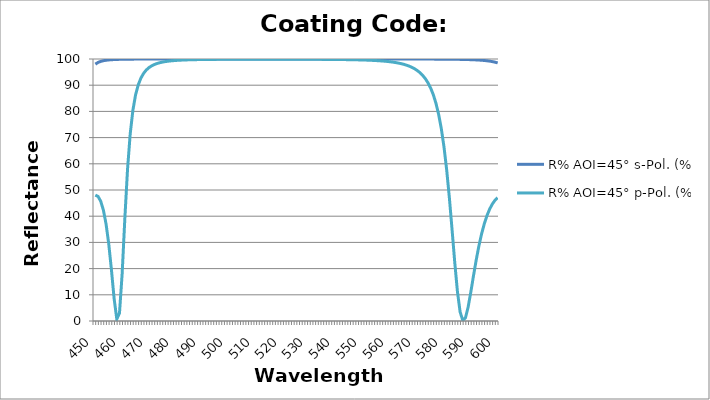
| Category | R% AOI=45° s-Pol. (%) | R% AOI=45° p-Pol. (%) |
|---|---|---|
| 450.0 | 98.025 | 48.06 |
| 451.0 | 98.683 | 47.558 |
| 452.0 | 99.088 | 45.725 |
| 453.0 | 99.349 | 42.319 |
| 454.0 | 99.523 | 37.002 |
| 455.0 | 99.643 | 29.419 |
| 456.0 | 99.727 | 19.526 |
| 457.0 | 99.788 | 8.559 |
| 458.0 | 99.833 | 0.729 |
| 459.0 | 99.866 | 2.992 |
| 460.0 | 99.892 | 18.081 |
| 461.0 | 99.911 | 39.146 |
| 462.0 | 99.926 | 57.883 |
| 463.0 | 99.938 | 71.419 |
| 464.0 | 99.948 | 80.43 |
| 465.0 | 99.956 | 86.316 |
| 466.0 | 99.962 | 90.147 |
| 467.0 | 99.967 | 92.739 |
| 468.0 | 99.972 | 94.532 |
| 469.0 | 99.975 | 95.8 |
| 470.0 | 99.978 | 96.716 |
| 471.0 | 99.981 | 97.391 |
| 472.0 | 99.983 | 97.897 |
| 473.0 | 99.985 | 98.282 |
| 474.0 | 99.986 | 98.579 |
| 475.0 | 99.988 | 98.812 |
| 476.0 | 99.989 | 98.997 |
| 477.0 | 99.99 | 99.145 |
| 478.0 | 99.99 | 99.265 |
| 479.0 | 99.991 | 99.363 |
| 480.0 | 99.992 | 99.443 |
| 481.0 | 99.993 | 99.51 |
| 482.0 | 99.993 | 99.566 |
| 483.0 | 99.994 | 99.613 |
| 484.0 | 99.994 | 99.653 |
| 485.0 | 99.994 | 99.687 |
| 486.0 | 99.995 | 99.716 |
| 487.0 | 99.995 | 99.742 |
| 488.0 | 99.995 | 99.763 |
| 489.0 | 99.996 | 99.782 |
| 490.0 | 99.996 | 99.798 |
| 491.0 | 99.996 | 99.812 |
| 492.0 | 99.996 | 99.825 |
| 493.0 | 99.996 | 99.836 |
| 494.0 | 99.996 | 99.845 |
| 495.0 | 99.996 | 99.854 |
| 496.0 | 99.997 | 99.862 |
| 497.0 | 99.997 | 99.868 |
| 498.0 | 99.997 | 99.874 |
| 499.0 | 99.997 | 99.879 |
| 500.0 | 99.997 | 99.884 |
| 501.0 | 99.997 | 99.888 |
| 502.0 | 99.997 | 99.892 |
| 503.0 | 99.997 | 99.895 |
| 504.0 | 99.997 | 99.898 |
| 505.0 | 99.997 | 99.9 |
| 506.0 | 99.997 | 99.902 |
| 507.0 | 99.997 | 99.904 |
| 508.0 | 99.997 | 99.906 |
| 509.0 | 99.997 | 99.907 |
| 510.0 | 99.997 | 99.908 |
| 511.0 | 99.997 | 99.909 |
| 512.0 | 99.998 | 99.909 |
| 513.0 | 99.998 | 99.91 |
| 514.0 | 99.998 | 99.91 |
| 515.0 | 99.998 | 99.91 |
| 516.0 | 99.998 | 99.91 |
| 517.0 | 99.998 | 99.909 |
| 518.0 | 99.997 | 99.908 |
| 519.0 | 99.997 | 99.907 |
| 520.0 | 99.997 | 99.906 |
| 521.0 | 99.997 | 99.905 |
| 522.0 | 99.997 | 99.903 |
| 523.0 | 99.997 | 99.901 |
| 524.0 | 99.997 | 99.899 |
| 525.0 | 99.997 | 99.897 |
| 526.0 | 99.997 | 99.894 |
| 527.0 | 99.997 | 99.891 |
| 528.0 | 99.997 | 99.888 |
| 529.0 | 99.997 | 99.884 |
| 530.0 | 99.997 | 99.88 |
| 531.0 | 99.997 | 99.875 |
| 532.0 | 99.997 | 99.87 |
| 533.0 | 99.997 | 99.865 |
| 534.0 | 99.997 | 99.859 |
| 535.0 | 99.996 | 99.852 |
| 536.0 | 99.996 | 99.845 |
| 537.0 | 99.996 | 99.837 |
| 538.0 | 99.996 | 99.828 |
| 539.0 | 99.996 | 99.818 |
| 540.0 | 99.996 | 99.807 |
| 541.0 | 99.996 | 99.796 |
| 542.0 | 99.996 | 99.782 |
| 543.0 | 99.995 | 99.768 |
| 544.0 | 99.995 | 99.752 |
| 545.0 | 99.995 | 99.734 |
| 546.0 | 99.995 | 99.714 |
| 547.0 | 99.994 | 99.692 |
| 548.0 | 99.994 | 99.667 |
| 549.0 | 99.994 | 99.639 |
| 550.0 | 99.994 | 99.608 |
| 551.0 | 99.993 | 99.572 |
| 552.0 | 99.993 | 99.532 |
| 553.0 | 99.992 | 99.488 |
| 554.0 | 99.992 | 99.436 |
| 555.0 | 99.991 | 99.378 |
| 556.0 | 99.991 | 99.312 |
| 557.0 | 99.99 | 99.236 |
| 558.0 | 99.99 | 99.149 |
| 559.0 | 99.989 | 99.048 |
| 560.0 | 99.988 | 98.931 |
| 561.0 | 99.987 | 98.794 |
| 562.0 | 99.986 | 98.635 |
| 563.0 | 99.985 | 98.448 |
| 564.0 | 99.984 | 98.227 |
| 565.0 | 99.983 | 97.966 |
| 566.0 | 99.981 | 97.654 |
| 567.0 | 99.98 | 97.279 |
| 568.0 | 99.978 | 96.827 |
| 569.0 | 99.976 | 96.285 |
| 570.0 | 99.974 | 95.623 |
| 571.0 | 99.971 | 94.808 |
| 572.0 | 99.968 | 93.8 |
| 573.0 | 99.965 | 92.54 |
| 574.0 | 99.962 | 90.955 |
| 575.0 | 99.958 | 88.945 |
| 576.0 | 99.954 | 86.379 |
| 577.0 | 99.949 | 83.083 |
| 578.0 | 99.943 | 78.835 |
| 579.0 | 99.937 | 73.366 |
| 580.0 | 99.929 | 66.374 |
| 581.0 | 99.921 | 57.601 |
| 582.0 | 99.911 | 46.977 |
| 583.0 | 99.9 | 34.872 |
| 584.0 | 99.887 | 22.366 |
| 585.0 | 99.871 | 11.249 |
| 586.0 | 99.854 | 3.472 |
| 587.0 | 99.833 | 0.194 |
| 588.0 | 99.808 | 1.225 |
| 589.0 | 99.779 | 5.352 |
| 590.0 | 99.745 | 11.11 |
| 591.0 | 99.704 | 17.329 |
| 592.0 | 99.654 | 23.286 |
| 593.0 | 99.594 | 28.622 |
| 594.0 | 99.521 | 33.21 |
| 595.0 | 99.432 | 37.044 |
| 596.0 | 99.321 | 40.177 |
| 597.0 | 99.183 | 42.679 |
| 598.0 | 99.01 | 44.621 |
| 599.0 | 98.789 | 46.068 |
| 600.0 | 98.506 | 47.074 |